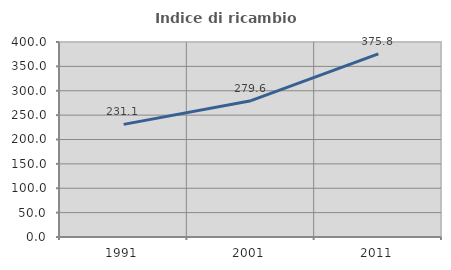
| Category | Indice di ricambio occupazionale  |
|---|---|
| 1991.0 | 231.068 |
| 2001.0 | 279.57 |
| 2011.0 | 375.824 |